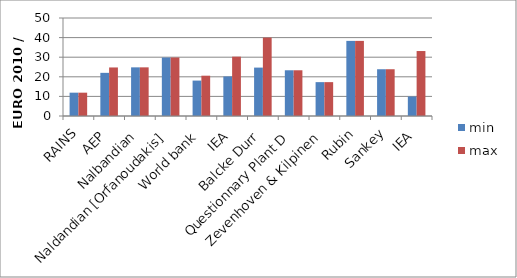
| Category | min | max |
|---|---|---|
| RAINS | 11.902 | 11.902 |
| AEP | 22.015 | 24.767 |
| Nalbandian | 24.823 | 24.823 |
| Naldandian [Orfanoudakis] | 29.844 | 29.844 |
| World bank | 18.071 | 20.564 |
| IEA | 20.184 | 30.276 |
| Balcke Durr | 24.697 | 40.013 |
| Questionnary Plant D | 23.33 | 23.33 |
| Zevenhoven & Kilpinen | 17.278 | 17.278 |
| Rubin | 38.32 | 38.32 |
| Sankey | 23.856 | 23.856 |
| IEA | 9.945 | 33.149 |